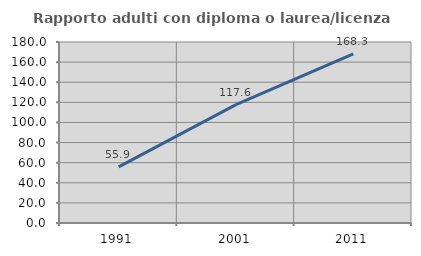
| Category | Rapporto adulti con diploma o laurea/licenza media  |
|---|---|
| 1991.0 | 55.882 |
| 2001.0 | 117.647 |
| 2011.0 | 168.293 |